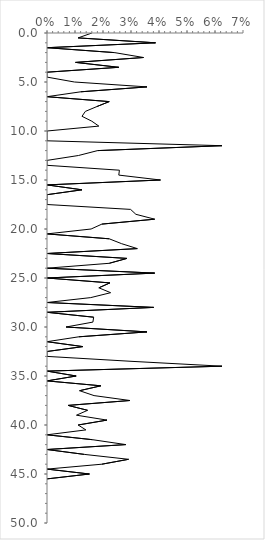
| Category | Series 0 |
|---|---|
| 0.016042780748663103 | 0 |
| 0.011111111111111112 | 0.5 |
| 0.03875968992248062 | 1 |
| 0.0 | 1.5 |
| 0.024096385542168676 | 2 |
| 0.034482758620689655 | 2.5 |
| 0.01020408163265306 | 3 |
| 0.02564102564102564 | 3.5 |
| 0.0 | 4 |
| 0.0 | 4.5 |
| 0.00980392156862745 | 5 |
| 0.03571428571428571 | 5.5 |
| 0.012048192771084338 | 6 |
| 0.0 | 6.5 |
| 0.022222222222222223 | 7 |
| 0.017857142857142856 | 7.5 |
| 0.0136986301369863 | 8 |
| 0.0125 | 8.5 |
| 0.016 | 9 |
| 0.018518518518518517 | 9.5 |
| 0.0 | 10 |
| 0.0 | 10.5 |
| 0.0 | 11 |
| 0.0625 | 11.5 |
| 0.018072289156626505 | 12 |
| 0.011235955056179775 | 12.5 |
| 0.0 | 13 |
| 0.0 | 13.5 |
| 0.02586206896551724 | 14 |
| 0.02564102564102564 | 14.5 |
| 0.04054054054054054 | 15 |
| 0.0 | 15.5 |
| 0.0125 | 16 |
| 0.0 | 16.5 |
| 0.0 | 17 |
| 0.0 | 17.5 |
| 0.029850746268656716 | 18 |
| 0.031746031746031744 | 18.5 |
| 0.038461538461538464 | 19 |
| 0.0196078431372549 | 19.5 |
| 0.015748031496062992 | 20 |
| 0.0 | 20.5 |
| 0.022222222222222223 | 21 |
| 0.02666666666666667 | 21.5 |
| 0.03225806451612903 | 22 |
| 0.0 | 22.5 |
| 0.02857142857142857 | 23 |
| 0.022222222222222223 | 23.5 |
| 0.0 | 24 |
| 0.038461538461538464 | 24.5 |
| 0.0 | 25 |
| 0.02247191011235955 | 25.5 |
| 0.018518518518518517 | 26 |
| 0.022727272727272728 | 26.5 |
| 0.015625 | 27 |
| 0.0 | 27.5 |
| 0.0380952380952381 | 28 |
| 0.0 | 28.5 |
| 0.016666666666666666 | 29 |
| 0.01639344262295082 | 29.5 |
| 0.006802721088435374 | 30 |
| 0.03571428571428571 | 30.5 |
| 0.011363636363636364 | 31 |
| 0.0 | 31.5 |
| 0.01282051282051282 | 32 |
| 0.0 | 32.5 |
| 0.0 | 33 |
| 0.03 | 33.5 |
| 0.0625 | 34 |
| 0.0 | 34.5 |
| 0.010416666666666666 | 35 |
| 0.0 | 35.5 |
| 0.019230769230769232 | 36 |
| 0.011627906976744186 | 36.5 |
| 0.01680672268907563 | 37 |
| 0.02962962962962963 | 37.5 |
| 0.007518796992481203 | 38 |
| 0.014492753623188406 | 38.5 |
| 0.010526315789473684 | 39 |
| 0.02142857142857143 | 39.5 |
| 0.011111111111111112 | 40 |
| 0.013888888888888888 | 40.5 |
| 0.0 | 41 |
| 0.016260162601626018 | 41.5 |
| 0.028169014084507043 | 42 |
| 0.0 | 42.5 |
| 0.013333333333333334 | 43 |
| 0.02912621359223301 | 43.5 |
| 0.0196078431372549 | 44 |
| 0.0 | 44.5 |
| 0.015151515151515152 | 45 |
| 0.0 | 45.5 |